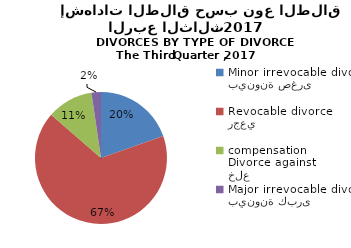
| Category | Series 1 |
|---|---|
| بينونة صغرى
Minor irrevocable divorce  | 59 |
| رجعي
Revocable divorce  | 201 |
| خلع
Divorce against compensation | 34 |
| بينونة كبرى
Major irrevocable divorce  | 7 |